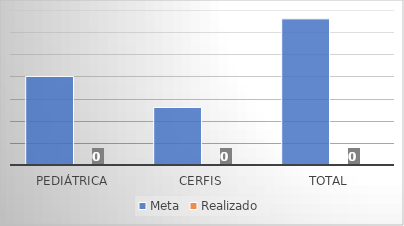
| Category | Meta | Realizado |
|---|---|---|
| Pediátrica | 40 | 0 |
| CERFIS | 26 | 0 |
| Total | 66 | 0 |